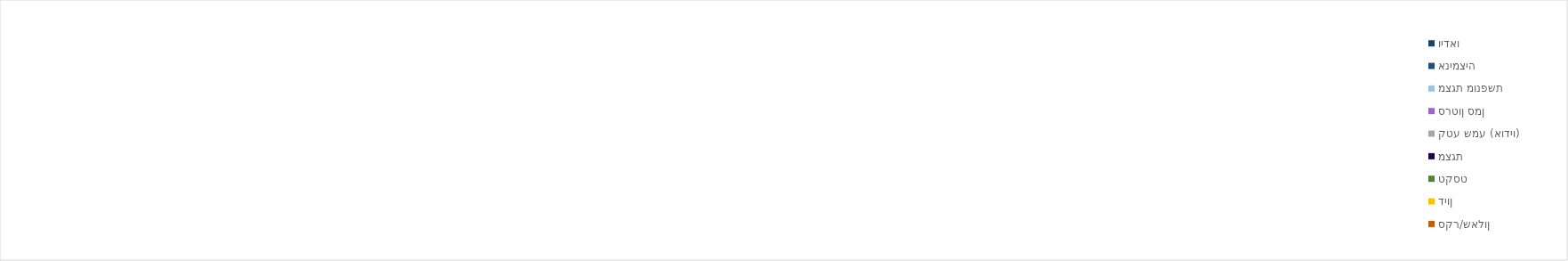
| Category | וידאו | אנימציה | מצגת מונפשת | סרטון סמן | קטע שמע (אודיו) | מצגת | טקסט | דיון | סקר/שאלון | עיבוד והטמעת ידע | התנסות ותרגול | יצירה |
|---|---|---|---|---|---|---|---|---|---|---|---|---|
| 0 | 0 | 0 | 0 | 0 | 0 | 0 | 0 | 0 | 0 | 0 | 0 | 0 |
| 1 | 0 | 0 | 0 | 0 | 0 | 0 | 0 | 0 | 0 | 0 | 0 | 0 |
| 2 | 0 | 0 | 0 | 0 | 0 | 0 | 0 | 0 | 0 | 0 | 0 | 0 |
| 3 | 0 | 0 | 0 | 0 | 0 | 0 | 0 | 0 | 0 | 0 | 0 | 0 |
| 4 | 0 | 0 | 0 | 0 | 0 | 0 | 0 | 0 | 0 | 0 | 0 | 0 |
| 5 | 0 | 0 | 0 | 0 | 0 | 0 | 0 | 0 | 0 | 0 | 0 | 0 |
| 6 | 0 | 0 | 0 | 0 | 0 | 0 | 0 | 0 | 0 | 0 | 0 | 0 |
| 7 | 0 | 0 | 0 | 0 | 0 | 0 | 0 | 0 | 0 | 0 | 0 | 0 |
| 8 | 0 | 0 | 0 | 0 | 0 | 0 | 0 | 0 | 0 | 0 | 0 | 0 |
| 9 | 0 | 0 | 0 | 0 | 0 | 0 | 0 | 0 | 0 | 0 | 0 | 0 |
| 10 | 0 | 0 | 0 | 0 | 0 | 0 | 0 | 0 | 0 | 0 | 0 | 0 |
| 11 | 0 | 0 | 0 | 0 | 0 | 0 | 0 | 0 | 0 | 0 | 0 | 0 |
| 12 | 0 | 0 | 0 | 0 | 0 | 0 | 0 | 0 | 0 | 0 | 0 | 0 |
| 13 | 0 | 0 | 0 | 0 | 0 | 0 | 0 | 0 | 0 | 0 | 0 | 0 |
| 14 | 0 | 0 | 0 | 0 | 0 | 0 | 0 | 0 | 0 | 0 | 0 | 0 |
| 15 | 0 | 0 | 0 | 0 | 0 | 0 | 0 | 0 | 0 | 0 | 0 | 0 |
| 16 | 0 | 0 | 0 | 0 | 0 | 0 | 0 | 0 | 0 | 0 | 0 | 0 |
| 17 | 0 | 0 | 0 | 0 | 0 | 0 | 0 | 0 | 0 | 0 | 0 | 0 |
| 18 | 0 | 0 | 0 | 0 | 0 | 0 | 0 | 0 | 0 | 0 | 0 | 0 |
| 19 | 0 | 0 | 0 | 0 | 0 | 0 | 0 | 0 | 0 | 0 | 0 | 0 |
| 20 | 0 | 0 | 0 | 0 | 0 | 0 | 0 | 0 | 0 | 0 | 0 | 0 |
| 21 | 0 | 0 | 0 | 0 | 0 | 0 | 0 | 0 | 0 | 0 | 0 | 0 |
| 22 | 0 | 0 | 0 | 0 | 0 | 0 | 0 | 0 | 0 | 0 | 0 | 0 |
| 23 | 0 | 0 | 0 | 0 | 0 | 0 | 0 | 0 | 0 | 0 | 0 | 0 |
| 24 | 0 | 0 | 0 | 0 | 0 | 0 | 0 | 0 | 0 | 0 | 0 | 0 |
| 25 | 0 | 0 | 0 | 0 | 0 | 0 | 0 | 0 | 0 | 0 | 0 | 0 |
| 26 | 0 | 0 | 0 | 0 | 0 | 0 | 0 | 0 | 0 | 0 | 0 | 0 |
| 27 | 0 | 0 | 0 | 0 | 0 | 0 | 0 | 0 | 0 | 0 | 0 | 0 |
| 28 | 0 | 0 | 0 | 0 | 0 | 0 | 0 | 0 | 0 | 0 | 0 | 0 |
| 29 | 0 | 0 | 0 | 0 | 0 | 0 | 0 | 0 | 0 | 0 | 0 | 0 |
| 30 | 0 | 0 | 0 | 0 | 0 | 0 | 0 | 0 | 0 | 0 | 0 | 0 |
| 31 | 0 | 0 | 0 | 0 | 0 | 0 | 0 | 0 | 0 | 0 | 0 | 0 |
| 32 | 0 | 0 | 0 | 0 | 0 | 0 | 0 | 0 | 0 | 0 | 0 | 0 |
| 33 | 0 | 0 | 0 | 0 | 0 | 0 | 0 | 0 | 0 | 0 | 0 | 0 |
| 34 | 0 | 0 | 0 | 0 | 0 | 0 | 0 | 0 | 0 | 0 | 0 | 0 |
| 35 | 0 | 0 | 0 | 0 | 0 | 0 | 0 | 0 | 0 | 0 | 0 | 0 |
| 36 | 0 | 0 | 0 | 0 | 0 | 0 | 0 | 0 | 0 | 0 | 0 | 0 |
| 37 | 0 | 0 | 0 | 0 | 0 | 0 | 0 | 0 | 0 | 0 | 0 | 0 |
| 38 | 0 | 0 | 0 | 0 | 0 | 0 | 0 | 0 | 0 | 0 | 0 | 0 |
| 39 | 0 | 0 | 0 | 0 | 0 | 0 | 0 | 0 | 0 | 0 | 0 | 0 |
| 40 | 0 | 0 | 0 | 0 | 0 | 0 | 0 | 0 | 0 | 0 | 0 | 0 |
| 41 | 0 | 0 | 0 | 0 | 0 | 0 | 0 | 0 | 0 | 0 | 0 | 0 |
| 42 | 0 | 0 | 0 | 0 | 0 | 0 | 0 | 0 | 0 | 0 | 0 | 0 |
| 43 | 0 | 0 | 0 | 0 | 0 | 0 | 0 | 0 | 0 | 0 | 0 | 0 |
| 44 | 0 | 0 | 0 | 0 | 0 | 0 | 0 | 0 | 0 | 0 | 0 | 0 |
| 45 | 0 | 0 | 0 | 0 | 0 | 0 | 0 | 0 | 0 | 0 | 0 | 0 |
| 46 | 0 | 0 | 0 | 0 | 0 | 0 | 0 | 0 | 0 | 0 | 0 | 0 |
| 47 | 0 | 0 | 0 | 0 | 0 | 0 | 0 | 0 | 0 | 0 | 0 | 0 |
| 48 | 0 | 0 | 0 | 0 | 0 | 0 | 0 | 0 | 0 | 0 | 0 | 0 |
| 49 | 0 | 0 | 0 | 0 | 0 | 0 | 0 | 0 | 0 | 0 | 0 | 0 |
| 50 | 0 | 0 | 0 | 0 | 0 | 0 | 0 | 0 | 0 | 0 | 0 | 0 |
| 51 | 0 | 0 | 0 | 0 | 0 | 0 | 0 | 0 | 0 | 0 | 0 | 0 |
| 52 | 0 | 0 | 0 | 0 | 0 | 0 | 0 | 0 | 0 | 0 | 0 | 0 |
| 53 | 0 | 0 | 0 | 0 | 0 | 0 | 0 | 0 | 0 | 0 | 0 | 0 |
| 54 | 0 | 0 | 0 | 0 | 0 | 0 | 0 | 0 | 0 | 0 | 0 | 0 |
| 55 | 0 | 0 | 0 | 0 | 0 | 0 | 0 | 0 | 0 | 0 | 0 | 0 |
| 56 | 0 | 0 | 0 | 0 | 0 | 0 | 0 | 0 | 0 | 0 | 0 | 0 |
| 57 | 0 | 0 | 0 | 0 | 0 | 0 | 0 | 0 | 0 | 0 | 0 | 0 |
| 58 | 0 | 0 | 0 | 0 | 0 | 0 | 0 | 0 | 0 | 0 | 0 | 0 |
| 59 | 0 | 0 | 0 | 0 | 0 | 0 | 0 | 0 | 0 | 0 | 0 | 0 |
| 60 | 0 | 0 | 0 | 0 | 0 | 0 | 0 | 0 | 0 | 0 | 0 | 0 |
| 61 | 0 | 0 | 0 | 0 | 0 | 0 | 0 | 0 | 0 | 0 | 0 | 0 |
| 62 | 0 | 0 | 0 | 0 | 0 | 0 | 0 | 0 | 0 | 0 | 0 | 0 |
| 63 | 0 | 0 | 0 | 0 | 0 | 0 | 0 | 0 | 0 | 0 | 0 | 0 |
| 64 | 0 | 0 | 0 | 0 | 0 | 0 | 0 | 0 | 0 | 0 | 0 | 0 |
| 65 | 0 | 0 | 0 | 0 | 0 | 0 | 0 | 0 | 0 | 0 | 0 | 0 |
| 66 | 0 | 0 | 0 | 0 | 0 | 0 | 0 | 0 | 0 | 0 | 0 | 0 |
| 67 | 0 | 0 | 0 | 0 | 0 | 0 | 0 | 0 | 0 | 0 | 0 | 0 |
| 68 | 0 | 0 | 0 | 0 | 0 | 0 | 0 | 0 | 0 | 0 | 0 | 0 |
| 69 | 0 | 0 | 0 | 0 | 0 | 0 | 0 | 0 | 0 | 0 | 0 | 0 |
| 70 | 0 | 0 | 0 | 0 | 0 | 0 | 0 | 0 | 0 | 0 | 0 | 0 |
| 71 | 0 | 0 | 0 | 0 | 0 | 0 | 0 | 0 | 0 | 0 | 0 | 0 |
| 72 | 0 | 0 | 0 | 0 | 0 | 0 | 0 | 0 | 0 | 0 | 0 | 0 |
| 73 | 0 | 0 | 0 | 0 | 0 | 0 | 0 | 0 | 0 | 0 | 0 | 0 |
| 74 | 0 | 0 | 0 | 0 | 0 | 0 | 0 | 0 | 0 | 0 | 0 | 0 |
| 75 | 0 | 0 | 0 | 0 | 0 | 0 | 0 | 0 | 0 | 0 | 0 | 0 |
| 76 | 0 | 0 | 0 | 0 | 0 | 0 | 0 | 0 | 0 | 0 | 0 | 0 |
| 77 | 0 | 0 | 0 | 0 | 0 | 0 | 0 | 0 | 0 | 0 | 0 | 0 |
| 78 | 0 | 0 | 0 | 0 | 0 | 0 | 0 | 0 | 0 | 0 | 0 | 0 |
| 79 | 0 | 0 | 0 | 0 | 0 | 0 | 0 | 0 | 0 | 0 | 0 | 0 |
| 80 | 0 | 0 | 0 | 0 | 0 | 0 | 0 | 0 | 0 | 0 | 0 | 0 |
| 81 | 0 | 0 | 0 | 0 | 0 | 0 | 0 | 0 | 0 | 0 | 0 | 0 |
| 82 | 0 | 0 | 0 | 0 | 0 | 0 | 0 | 0 | 0 | 0 | 0 | 0 |
| 83 | 0 | 0 | 0 | 0 | 0 | 0 | 0 | 0 | 0 | 0 | 0 | 0 |
| 84 | 0 | 0 | 0 | 0 | 0 | 0 | 0 | 0 | 0 | 0 | 0 | 0 |
| 85 | 0 | 0 | 0 | 0 | 0 | 0 | 0 | 0 | 0 | 0 | 0 | 0 |
| 86 | 0 | 0 | 0 | 0 | 0 | 0 | 0 | 0 | 0 | 0 | 0 | 0 |
| 87 | 0 | 0 | 0 | 0 | 0 | 0 | 0 | 0 | 0 | 0 | 0 | 0 |
| 88 | 0 | 0 | 0 | 0 | 0 | 0 | 0 | 0 | 0 | 0 | 0 | 0 |
| 89 | 0 | 0 | 0 | 0 | 0 | 0 | 0 | 0 | 0 | 0 | 0 | 0 |
| 90 | 0 | 0 | 0 | 0 | 0 | 0 | 0 | 0 | 0 | 0 | 0 | 0 |
| 91 | 0 | 0 | 0 | 0 | 0 | 0 | 0 | 0 | 0 | 0 | 0 | 0 |
| 92 | 0 | 0 | 0 | 0 | 0 | 0 | 0 | 0 | 0 | 0 | 0 | 0 |
| 93 | 0 | 0 | 0 | 0 | 0 | 0 | 0 | 0 | 0 | 0 | 0 | 0 |
| 94 | 0 | 0 | 0 | 0 | 0 | 0 | 0 | 0 | 0 | 0 | 0 | 0 |
| 95 | 0 | 0 | 0 | 0 | 0 | 0 | 0 | 0 | 0 | 0 | 0 | 0 |
| 96 | 0 | 0 | 0 | 0 | 0 | 0 | 0 | 0 | 0 | 0 | 0 | 0 |
| 97 | 0 | 0 | 0 | 0 | 0 | 0 | 0 | 0 | 0 | 0 | 0 | 0 |
| 98 | 0 | 0 | 0 | 0 | 0 | 0 | 0 | 0 | 0 | 0 | 0 | 0 |
| 99 | 0 | 0 | 0 | 0 | 0 | 0 | 0 | 0 | 0 | 0 | 0 | 0 |
| 100 | 0 | 0 | 0 | 0 | 0 | 0 | 0 | 0 | 0 | 0 | 0 | 0 |
| 101 | 0 | 0 | 0 | 0 | 0 | 0 | 0 | 0 | 0 | 0 | 0 | 0 |
| 102 | 0 | 0 | 0 | 0 | 0 | 0 | 0 | 0 | 0 | 0 | 0 | 0 |
| 103 | 0 | 0 | 0 | 0 | 0 | 0 | 0 | 0 | 0 | 0 | 0 | 0 |
| 104 | 0 | 0 | 0 | 0 | 0 | 0 | 0 | 0 | 0 | 0 | 0 | 0 |
| 105 | 0 | 0 | 0 | 0 | 0 | 0 | 0 | 0 | 0 | 0 | 0 | 0 |
| 106 | 0 | 0 | 0 | 0 | 0 | 0 | 0 | 0 | 0 | 0 | 0 | 0 |
| 107 | 0 | 0 | 0 | 0 | 0 | 0 | 0 | 0 | 0 | 0 | 0 | 0 |
| 108 | 0 | 0 | 0 | 0 | 0 | 0 | 0 | 0 | 0 | 0 | 0 | 0 |
| 109 | 0 | 0 | 0 | 0 | 0 | 0 | 0 | 0 | 0 | 0 | 0 | 0 |
| 110 | 0 | 0 | 0 | 0 | 0 | 0 | 0 | 0 | 0 | 0 | 0 | 0 |
| 111 | 0 | 0 | 0 | 0 | 0 | 0 | 0 | 0 | 0 | 0 | 0 | 0 |
| 112 | 0 | 0 | 0 | 0 | 0 | 0 | 0 | 0 | 0 | 0 | 0 | 0 |
| 113 | 0 | 0 | 0 | 0 | 0 | 0 | 0 | 0 | 0 | 0 | 0 | 0 |
| 114 | 0 | 0 | 0 | 0 | 0 | 0 | 0 | 0 | 0 | 0 | 0 | 0 |
| 115 | 0 | 0 | 0 | 0 | 0 | 0 | 0 | 0 | 0 | 0 | 0 | 0 |
| 116 | 0 | 0 | 0 | 0 | 0 | 0 | 0 | 0 | 0 | 0 | 0 | 0 |
| 117 | 0 | 0 | 0 | 0 | 0 | 0 | 0 | 0 | 0 | 0 | 0 | 0 |
| 118 | 0 | 0 | 0 | 0 | 0 | 0 | 0 | 0 | 0 | 0 | 0 | 0 |
| 119 | 0 | 0 | 0 | 0 | 0 | 0 | 0 | 0 | 0 | 0 | 0 | 0 |
| 120 | 0 | 0 | 0 | 0 | 0 | 0 | 0 | 0 | 0 | 0 | 0 | 0 |
| 121 | 0 | 0 | 0 | 0 | 0 | 0 | 0 | 0 | 0 | 0 | 0 | 0 |
| 122 | 0 | 0 | 0 | 0 | 0 | 0 | 0 | 0 | 0 | 0 | 0 | 0 |
| 123 | 0 | 0 | 0 | 0 | 0 | 0 | 0 | 0 | 0 | 0 | 0 | 0 |
| 124 | 0 | 0 | 0 | 0 | 0 | 0 | 0 | 0 | 0 | 0 | 0 | 0 |
| 125 | 0 | 0 | 0 | 0 | 0 | 0 | 0 | 0 | 0 | 0 | 0 | 0 |
| 126 | 0 | 0 | 0 | 0 | 0 | 0 | 0 | 0 | 0 | 0 | 0 | 0 |
| 127 | 0 | 0 | 0 | 0 | 0 | 0 | 0 | 0 | 0 | 0 | 0 | 0 |
| 128 | 0 | 0 | 0 | 0 | 0 | 0 | 0 | 0 | 0 | 0 | 0 | 0 |
| 129 | 0 | 0 | 0 | 0 | 0 | 0 | 0 | 0 | 0 | 0 | 0 | 0 |
| 130 | 0 | 0 | 0 | 0 | 0 | 0 | 0 | 0 | 0 | 0 | 0 | 0 |
| 131 | 0 | 0 | 0 | 0 | 0 | 0 | 0 | 0 | 0 | 0 | 0 | 0 |
| 132 | 0 | 0 | 0 | 0 | 0 | 0 | 0 | 0 | 0 | 0 | 0 | 0 |
| 133 | 0 | 0 | 0 | 0 | 0 | 0 | 0 | 0 | 0 | 0 | 0 | 0 |
| 134 | 0 | 0 | 0 | 0 | 0 | 0 | 0 | 0 | 0 | 0 | 0 | 0 |
| 135 | 0 | 0 | 0 | 0 | 0 | 0 | 0 | 0 | 0 | 0 | 0 | 0 |
| 136 | 0 | 0 | 0 | 0 | 0 | 0 | 0 | 0 | 0 | 0 | 0 | 0 |
| 137 | 0 | 0 | 0 | 0 | 0 | 0 | 0 | 0 | 0 | 0 | 0 | 0 |
| 138 | 0 | 0 | 0 | 0 | 0 | 0 | 0 | 0 | 0 | 0 | 0 | 0 |
| 139 | 0 | 0 | 0 | 0 | 0 | 0 | 0 | 0 | 0 | 0 | 0 | 0 |
| 140 | 0 | 0 | 0 | 0 | 0 | 0 | 0 | 0 | 0 | 0 | 0 | 0 |
| 141 | 0 | 0 | 0 | 0 | 0 | 0 | 0 | 0 | 0 | 0 | 0 | 0 |
| 142 | 0 | 0 | 0 | 0 | 0 | 0 | 0 | 0 | 0 | 0 | 0 | 0 |
| 143 | 0 | 0 | 0 | 0 | 0 | 0 | 0 | 0 | 0 | 0 | 0 | 0 |
| 144 | 0 | 0 | 0 | 0 | 0 | 0 | 0 | 0 | 0 | 0 | 0 | 0 |
| 145 | 0 | 0 | 0 | 0 | 0 | 0 | 0 | 0 | 0 | 0 | 0 | 0 |
| 146 | 0 | 0 | 0 | 0 | 0 | 0 | 0 | 0 | 0 | 0 | 0 | 0 |
| 147 | 0 | 0 | 0 | 0 | 0 | 0 | 0 | 0 | 0 | 0 | 0 | 0 |
| 148 | 0 | 0 | 0 | 0 | 0 | 0 | 0 | 0 | 0 | 0 | 0 | 0 |
| 149 | 0 | 0 | 0 | 0 | 0 | 0 | 0 | 0 | 0 | 0 | 0 | 0 |
| 150 | 0 | 0 | 0 | 0 | 0 | 0 | 0 | 0 | 0 | 0 | 0 | 0 |
| 151 | 0 | 0 | 0 | 0 | 0 | 0 | 0 | 0 | 0 | 0 | 0 | 0 |
| 152 | 0 | 0 | 0 | 0 | 0 | 0 | 0 | 0 | 0 | 0 | 0 | 0 |
| 153 | 0 | 0 | 0 | 0 | 0 | 0 | 0 | 0 | 0 | 0 | 0 | 0 |
| 154 | 0 | 0 | 0 | 0 | 0 | 0 | 0 | 0 | 0 | 0 | 0 | 0 |
| 155 | 0 | 0 | 0 | 0 | 0 | 0 | 0 | 0 | 0 | 0 | 0 | 0 |
| 156 | 0 | 0 | 0 | 0 | 0 | 0 | 0 | 0 | 0 | 0 | 0 | 0 |
| 157 | 0 | 0 | 0 | 0 | 0 | 0 | 0 | 0 | 0 | 0 | 0 | 0 |
| 158 | 0 | 0 | 0 | 0 | 0 | 0 | 0 | 0 | 0 | 0 | 0 | 0 |
| 159 | 0 | 0 | 0 | 0 | 0 | 0 | 0 | 0 | 0 | 0 | 0 | 0 |
| 160 | 0 | 0 | 0 | 0 | 0 | 0 | 0 | 0 | 0 | 0 | 0 | 0 |
| 161 | 0 | 0 | 0 | 0 | 0 | 0 | 0 | 0 | 0 | 0 | 0 | 0 |
| 162 | 0 | 0 | 0 | 0 | 0 | 0 | 0 | 0 | 0 | 0 | 0 | 0 |
| 163 | 0 | 0 | 0 | 0 | 0 | 0 | 0 | 0 | 0 | 0 | 0 | 0 |
| 164 | 0 | 0 | 0 | 0 | 0 | 0 | 0 | 0 | 0 | 0 | 0 | 0 |
| 165 | 0 | 0 | 0 | 0 | 0 | 0 | 0 | 0 | 0 | 0 | 0 | 0 |
| 166 | 0 | 0 | 0 | 0 | 0 | 0 | 0 | 0 | 0 | 0 | 0 | 0 |
| 167 | 0 | 0 | 0 | 0 | 0 | 0 | 0 | 0 | 0 | 0 | 0 | 0 |
| 168 | 0 | 0 | 0 | 0 | 0 | 0 | 0 | 0 | 0 | 0 | 0 | 0 |
| 169 | 0 | 0 | 0 | 0 | 0 | 0 | 0 | 0 | 0 | 0 | 0 | 0 |
| 170 | 0 | 0 | 0 | 0 | 0 | 0 | 0 | 0 | 0 | 0 | 0 | 0 |
| 171 | 0 | 0 | 0 | 0 | 0 | 0 | 0 | 0 | 0 | 0 | 0 | 0 |
| 172 | 0 | 0 | 0 | 0 | 0 | 0 | 0 | 0 | 0 | 0 | 0 | 0 |
| 173 | 0 | 0 | 0 | 0 | 0 | 0 | 0 | 0 | 0 | 0 | 0 | 0 |
| 174 | 0 | 0 | 0 | 0 | 0 | 0 | 0 | 0 | 0 | 0 | 0 | 0 |
| 175 | 0 | 0 | 0 | 0 | 0 | 0 | 0 | 0 | 0 | 0 | 0 | 0 |
| 176 | 0 | 0 | 0 | 0 | 0 | 0 | 0 | 0 | 0 | 0 | 0 | 0 |
| 177 | 0 | 0 | 0 | 0 | 0 | 0 | 0 | 0 | 0 | 0 | 0 | 0 |
| 178 | 0 | 0 | 0 | 0 | 0 | 0 | 0 | 0 | 0 | 0 | 0 | 0 |
| 179 | 0 | 0 | 0 | 0 | 0 | 0 | 0 | 0 | 0 | 0 | 0 | 0 |
| 180 | 0 | 0 | 0 | 0 | 0 | 0 | 0 | 0 | 0 | 0 | 0 | 0 |
| 181 | 0 | 0 | 0 | 0 | 0 | 0 | 0 | 0 | 0 | 0 | 0 | 0 |
| 182 | 0 | 0 | 0 | 0 | 0 | 0 | 0 | 0 | 0 | 0 | 0 | 0 |
| 183 | 0 | 0 | 0 | 0 | 0 | 0 | 0 | 0 | 0 | 0 | 0 | 0 |
| 184 | 0 | 0 | 0 | 0 | 0 | 0 | 0 | 0 | 0 | 0 | 0 | 0 |
| 185 | 0 | 0 | 0 | 0 | 0 | 0 | 0 | 0 | 0 | 0 | 0 | 0 |
| 186 | 0 | 0 | 0 | 0 | 0 | 0 | 0 | 0 | 0 | 0 | 0 | 0 |
| 187 | 0 | 0 | 0 | 0 | 0 | 0 | 0 | 0 | 0 | 0 | 0 | 0 |
| 188 | 0 | 0 | 0 | 0 | 0 | 0 | 0 | 0 | 0 | 0 | 0 | 0 |
| 189 | 0 | 0 | 0 | 0 | 0 | 0 | 0 | 0 | 0 | 0 | 0 | 0 |
| 190 | 0 | 0 | 0 | 0 | 0 | 0 | 0 | 0 | 0 | 0 | 0 | 0 |
| 191 | 0 | 0 | 0 | 0 | 0 | 0 | 0 | 0 | 0 | 0 | 0 | 0 |
| 192 | 0 | 0 | 0 | 0 | 0 | 0 | 0 | 0 | 0 | 0 | 0 | 0 |
| 193 | 0 | 0 | 0 | 0 | 0 | 0 | 0 | 0 | 0 | 0 | 0 | 0 |
| 194 | 0 | 0 | 0 | 0 | 0 | 0 | 0 | 0 | 0 | 0 | 0 | 0 |
| 195 | 0 | 0 | 0 | 0 | 0 | 0 | 0 | 0 | 0 | 0 | 0 | 0 |
| 196 | 0 | 0 | 0 | 0 | 0 | 0 | 0 | 0 | 0 | 0 | 0 | 0 |
| 197 | 0 | 0 | 0 | 0 | 0 | 0 | 0 | 0 | 0 | 0 | 0 | 0 |
| 198 | 0 | 0 | 0 | 0 | 0 | 0 | 0 | 0 | 0 | 0 | 0 | 0 |
| 199 | 0 | 0 | 0 | 0 | 0 | 0 | 0 | 0 | 0 | 0 | 0 | 0 |
| 200 | 0 | 0 | 0 | 0 | 0 | 0 | 0 | 0 | 0 | 0 | 0 | 0 |
| 201 | 0 | 0 | 0 | 0 | 0 | 0 | 0 | 0 | 0 | 0 | 0 | 0 |
| 202 | 0 | 0 | 0 | 0 | 0 | 0 | 0 | 0 | 0 | 0 | 0 | 0 |
| 203 | 0 | 0 | 0 | 0 | 0 | 0 | 0 | 0 | 0 | 0 | 0 | 0 |
| 204 | 0 | 0 | 0 | 0 | 0 | 0 | 0 | 0 | 0 | 0 | 0 | 0 |
| 205 | 0 | 0 | 0 | 0 | 0 | 0 | 0 | 0 | 0 | 0 | 0 | 0 |
| 206 | 0 | 0 | 0 | 0 | 0 | 0 | 0 | 0 | 0 | 0 | 0 | 0 |
| 207 | 0 | 0 | 0 | 0 | 0 | 0 | 0 | 0 | 0 | 0 | 0 | 0 |
| 208 | 0 | 0 | 0 | 0 | 0 | 0 | 0 | 0 | 0 | 0 | 0 | 0 |
| 209 | 0 | 0 | 0 | 0 | 0 | 0 | 0 | 0 | 0 | 0 | 0 | 0 |
| 210 | 0 | 0 | 0 | 0 | 0 | 0 | 0 | 0 | 0 | 0 | 0 | 0 |
| 211 | 0 | 0 | 0 | 0 | 0 | 0 | 0 | 0 | 0 | 0 | 0 | 0 |
| 212 | 0 | 0 | 0 | 0 | 0 | 0 | 0 | 0 | 0 | 0 | 0 | 0 |
| 213 | 0 | 0 | 0 | 0 | 0 | 0 | 0 | 0 | 0 | 0 | 0 | 0 |
| 214 | 0 | 0 | 0 | 0 | 0 | 0 | 0 | 0 | 0 | 0 | 0 | 0 |
| 215 | 0 | 0 | 0 | 0 | 0 | 0 | 0 | 0 | 0 | 0 | 0 | 0 |
| 216 | 0 | 0 | 0 | 0 | 0 | 0 | 0 | 0 | 0 | 0 | 0 | 0 |
| 217 | 0 | 0 | 0 | 0 | 0 | 0 | 0 | 0 | 0 | 0 | 0 | 0 |
| 218 | 0 | 0 | 0 | 0 | 0 | 0 | 0 | 0 | 0 | 0 | 0 | 0 |
| 219 | 0 | 0 | 0 | 0 | 0 | 0 | 0 | 0 | 0 | 0 | 0 | 0 |
| 220 | 0 | 0 | 0 | 0 | 0 | 0 | 0 | 0 | 0 | 0 | 0 | 0 |
| 221 | 0 | 0 | 0 | 0 | 0 | 0 | 0 | 0 | 0 | 0 | 0 | 0 |
| 222 | 0 | 0 | 0 | 0 | 0 | 0 | 0 | 0 | 0 | 0 | 0 | 0 |
| 223 | 0 | 0 | 0 | 0 | 0 | 0 | 0 | 0 | 0 | 0 | 0 | 0 |
| 224 | 0 | 0 | 0 | 0 | 0 | 0 | 0 | 0 | 0 | 0 | 0 | 0 |
| 225 | 0 | 0 | 0 | 0 | 0 | 0 | 0 | 0 | 0 | 0 | 0 | 0 |
| 226 | 0 | 0 | 0 | 0 | 0 | 0 | 0 | 0 | 0 | 0 | 0 | 0 |
| 227 | 0 | 0 | 0 | 0 | 0 | 0 | 0 | 0 | 0 | 0 | 0 | 0 |
| 228 | 0 | 0 | 0 | 0 | 0 | 0 | 0 | 0 | 0 | 0 | 0 | 0 |
| 229 | 0 | 0 | 0 | 0 | 0 | 0 | 0 | 0 | 0 | 0 | 0 | 0 |
| 230 | 0 | 0 | 0 | 0 | 0 | 0 | 0 | 0 | 0 | 0 | 0 | 0 |
| 231 | 0 | 0 | 0 | 0 | 0 | 0 | 0 | 0 | 0 | 0 | 0 | 0 |
| 232 | 0 | 0 | 0 | 0 | 0 | 0 | 0 | 0 | 0 | 0 | 0 | 0 |
| 233 | 0 | 0 | 0 | 0 | 0 | 0 | 0 | 0 | 0 | 0 | 0 | 0 |
| 234 | 0 | 0 | 0 | 0 | 0 | 0 | 0 | 0 | 0 | 0 | 0 | 0 |
| 235 | 0 | 0 | 0 | 0 | 0 | 0 | 0 | 0 | 0 | 0 | 0 | 0 |
| 236 | 0 | 0 | 0 | 0 | 0 | 0 | 0 | 0 | 0 | 0 | 0 | 0 |
| 237 | 0 | 0 | 0 | 0 | 0 | 0 | 0 | 0 | 0 | 0 | 0 | 0 |
| 238 | 0 | 0 | 0 | 0 | 0 | 0 | 0 | 0 | 0 | 0 | 0 | 0 |
| 239 | 0 | 0 | 0 | 0 | 0 | 0 | 0 | 0 | 0 | 0 | 0 | 0 |
| 240 | 0 | 0 | 0 | 0 | 0 | 0 | 0 | 0 | 0 | 0 | 0 | 0 |
| 241 | 0 | 0 | 0 | 0 | 0 | 0 | 0 | 0 | 0 | 0 | 0 | 0 |
| 242 | 0 | 0 | 0 | 0 | 0 | 0 | 0 | 0 | 0 | 0 | 0 | 0 |
| 243 | 0 | 0 | 0 | 0 | 0 | 0 | 0 | 0 | 0 | 0 | 0 | 0 |
| 244 | 0 | 0 | 0 | 0 | 0 | 0 | 0 | 0 | 0 | 0 | 0 | 0 |
| 245 | 0 | 0 | 0 | 0 | 0 | 0 | 0 | 0 | 0 | 0 | 0 | 0 |
| 246 | 0 | 0 | 0 | 0 | 0 | 0 | 0 | 0 | 0 | 0 | 0 | 0 |
| 247 | 0 | 0 | 0 | 0 | 0 | 0 | 0 | 0 | 0 | 0 | 0 | 0 |
| 248 | 0 | 0 | 0 | 0 | 0 | 0 | 0 | 0 | 0 | 0 | 0 | 0 |
| 249 | 0 | 0 | 0 | 0 | 0 | 0 | 0 | 0 | 0 | 0 | 0 | 0 |
| 250 | 0 | 0 | 0 | 0 | 0 | 0 | 0 | 0 | 0 | 0 | 0 | 0 |
| 251 | 0 | 0 | 0 | 0 | 0 | 0 | 0 | 0 | 0 | 0 | 0 | 0 |
| 252 | 0 | 0 | 0 | 0 | 0 | 0 | 0 | 0 | 0 | 0 | 0 | 0 |
| 253 | 0 | 0 | 0 | 0 | 0 | 0 | 0 | 0 | 0 | 0 | 0 | 0 |
| 254 | 0 | 0 | 0 | 0 | 0 | 0 | 0 | 0 | 0 | 0 | 0 | 0 |
| 255 | 0 | 0 | 0 | 0 | 0 | 0 | 0 | 0 | 0 | 0 | 0 | 0 |
| 256 | 0 | 0 | 0 | 0 | 0 | 0 | 0 | 0 | 0 | 0 | 0 | 0 |
| 257 | 0 | 0 | 0 | 0 | 0 | 0 | 0 | 0 | 0 | 0 | 0 | 0 |
| 258 | 0 | 0 | 0 | 0 | 0 | 0 | 0 | 0 | 0 | 0 | 0 | 0 |
| 259 | 0 | 0 | 0 | 0 | 0 | 0 | 0 | 0 | 0 | 0 | 0 | 0 |
| 260 | 0 | 0 | 0 | 0 | 0 | 0 | 0 | 0 | 0 | 0 | 0 | 0 |
| 261 | 0 | 0 | 0 | 0 | 0 | 0 | 0 | 0 | 0 | 0 | 0 | 0 |
| 262 | 0 | 0 | 0 | 0 | 0 | 0 | 0 | 0 | 0 | 0 | 0 | 0 |
| 263 | 0 | 0 | 0 | 0 | 0 | 0 | 0 | 0 | 0 | 0 | 0 | 0 |
| 264 | 0 | 0 | 0 | 0 | 0 | 0 | 0 | 0 | 0 | 0 | 0 | 0 |
| 265 | 0 | 0 | 0 | 0 | 0 | 0 | 0 | 0 | 0 | 0 | 0 | 0 |
| 266 | 0 | 0 | 0 | 0 | 0 | 0 | 0 | 0 | 0 | 0 | 0 | 0 |
| 267 | 0 | 0 | 0 | 0 | 0 | 0 | 0 | 0 | 0 | 0 | 0 | 0 |
| 268 | 0 | 0 | 0 | 0 | 0 | 0 | 0 | 0 | 0 | 0 | 0 | 0 |
| 269 | 0 | 0 | 0 | 0 | 0 | 0 | 0 | 0 | 0 | 0 | 0 | 0 |
| 270 | 0 | 0 | 0 | 0 | 0 | 0 | 0 | 0 | 0 | 0 | 0 | 0 |
| 271 | 0 | 0 | 0 | 0 | 0 | 0 | 0 | 0 | 0 | 0 | 0 | 0 |
| 272 | 0 | 0 | 0 | 0 | 0 | 0 | 0 | 0 | 0 | 0 | 0 | 0 |
| 273 | 0 | 0 | 0 | 0 | 0 | 0 | 0 | 0 | 0 | 0 | 0 | 0 |
| 274 | 0 | 0 | 0 | 0 | 0 | 0 | 0 | 0 | 0 | 0 | 0 | 0 |
| 275 | 0 | 0 | 0 | 0 | 0 | 0 | 0 | 0 | 0 | 0 | 0 | 0 |
| 276 | 0 | 0 | 0 | 0 | 0 | 0 | 0 | 0 | 0 | 0 | 0 | 0 |
| 277 | 0 | 0 | 0 | 0 | 0 | 0 | 0 | 0 | 0 | 0 | 0 | 0 |
| 278 | 0 | 0 | 0 | 0 | 0 | 0 | 0 | 0 | 0 | 0 | 0 | 0 |
| 279 | 0 | 0 | 0 | 0 | 0 | 0 | 0 | 0 | 0 | 0 | 0 | 0 |
| 280 | 0 | 0 | 0 | 0 | 0 | 0 | 0 | 0 | 0 | 0 | 0 | 0 |
| 281 | 0 | 0 | 0 | 0 | 0 | 0 | 0 | 0 | 0 | 0 | 0 | 0 |
| 282 | 0 | 0 | 0 | 0 | 0 | 0 | 0 | 0 | 0 | 0 | 0 | 0 |
| 283 | 0 | 0 | 0 | 0 | 0 | 0 | 0 | 0 | 0 | 0 | 0 | 0 |
| 284 | 0 | 0 | 0 | 0 | 0 | 0 | 0 | 0 | 0 | 0 | 0 | 0 |
| 285 | 0 | 0 | 0 | 0 | 0 | 0 | 0 | 0 | 0 | 0 | 0 | 0 |
| 286 | 0 | 0 | 0 | 0 | 0 | 0 | 0 | 0 | 0 | 0 | 0 | 0 |
| 287 | 0 | 0 | 0 | 0 | 0 | 0 | 0 | 0 | 0 | 0 | 0 | 0 |
| 288 | 0 | 0 | 0 | 0 | 0 | 0 | 0 | 0 | 0 | 0 | 0 | 0 |
| 289 | 0 | 0 | 0 | 0 | 0 | 0 | 0 | 0 | 0 | 0 | 0 | 0 |
| 290 | 0 | 0 | 0 | 0 | 0 | 0 | 0 | 0 | 0 | 0 | 0 | 0 |
| 291 | 0 | 0 | 0 | 0 | 0 | 0 | 0 | 0 | 0 | 0 | 0 | 0 |
| 292 | 0 | 0 | 0 | 0 | 0 | 0 | 0 | 0 | 0 | 0 | 0 | 0 |
| 293 | 0 | 0 | 0 | 0 | 0 | 0 | 0 | 0 | 0 | 0 | 0 | 0 |
| 294 | 0 | 0 | 0 | 0 | 0 | 0 | 0 | 0 | 0 | 0 | 0 | 0 |
| 295 | 0 | 0 | 0 | 0 | 0 | 0 | 0 | 0 | 0 | 0 | 0 | 0 |
| 296 | 0 | 0 | 0 | 0 | 0 | 0 | 0 | 0 | 0 | 0 | 0 | 0 |
| 297 | 0 | 0 | 0 | 0 | 0 | 0 | 0 | 0 | 0 | 0 | 0 | 0 |